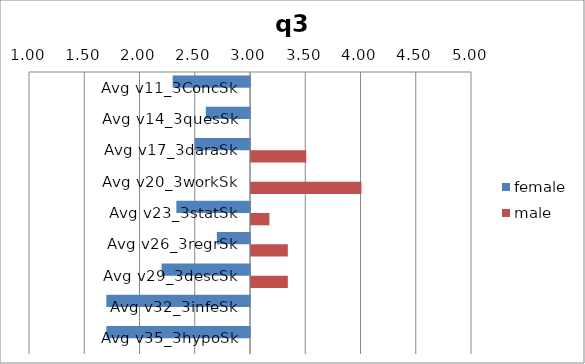
| Category | female | male |
|---|---|---|
| Avg v11_3ConcSk | 2.3 | 3 |
| Avg v14_3quesSk | 2.6 | 3 |
| Avg v17_3daraSk | 2.5 | 3.5 |
| Avg v20_3workSk | 3 | 4 |
| Avg v23_3statSk | 2.333 | 3.167 |
| Avg v26_3regrSk | 2.7 | 3.333 |
| Avg v29_3descSk | 2.2 | 3.333 |
| Avg v32_3infeSk | 1.7 | 3 |
| Avg v35_3hypoSk | 1.7 | 3 |